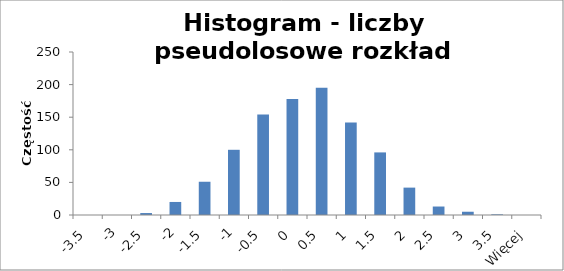
| Category | Częstość |
|---|---|
| -3,5 | 0 |
| -3 | 0 |
| -2,5 | 3 |
| -2 | 20 |
| -1,5 | 51 |
| -1 | 100 |
| -0,5 | 154 |
| 0 | 178 |
| 0,5 | 195 |
| 1 | 142 |
| 1,5 | 96 |
| 2 | 42 |
| 2,5 | 13 |
| 3 | 5 |
| 3,5 | 1 |
| Więcej | 0 |